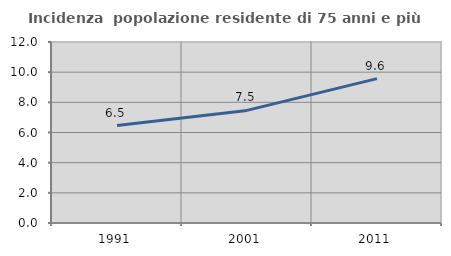
| Category | Incidenza  popolazione residente di 75 anni e più |
|---|---|
| 1991.0 | 6.459 |
| 2001.0 | 7.466 |
| 2011.0 | 9.572 |